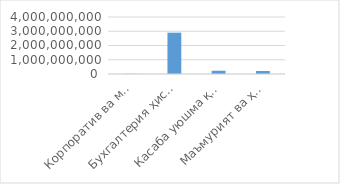
| Category | Товар / хизматнинг
жами суммаси
(cумда) 
(ҚҚС билан) |
|---|---|
| Корпоратив ва мулкий муносабатлар бошқармаси | 13000000 |
| Бухгалтерия ҳисоби ва методология бошқармаси | 2900000000 |
| Касаба уюшма қўмитаси | 227700000 |
| Маъмурият ва ҳужжатлар ижроси назорати бошқармаси | 210750000 |